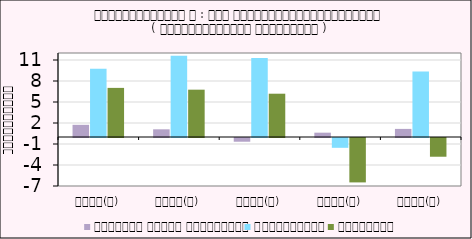
| Category | កសិកម្ម នេសាទ និងព្រៃឈើ | ឧស្សាហកម្ម | សេវាកម្ម |
|---|---|---|---|
| ២០១៧(ក) | 1.739 | 9.748 | 7.016 |
| ២០១៨(ក) | 1.098 | 11.605 | 6.76 |
| ២០១៩(ប) | -0.532 | 11.283 | 6.185 |
| ២០២០(ប) | 0.619 | -1.402 | -6.343 |
| ២០២១(ព) | 1.156 | 9.37 | -2.676 |